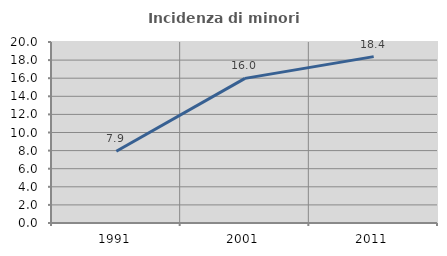
| Category | Incidenza di minori stranieri |
|---|---|
| 1991.0 | 7.933 |
| 2001.0 | 15.981 |
| 2011.0 | 18.386 |